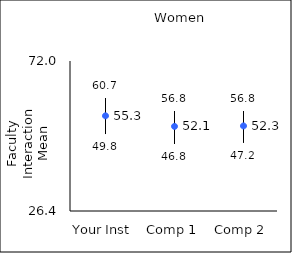
| Category | 25th percentile | 75th percentile | Mean |
|---|---|---|---|
| Your Inst | 49.8 | 60.7 | 55.33 |
| Comp 1 | 46.8 | 56.8 | 52.12 |
| Comp 2 | 47.2 | 56.8 | 52.26 |